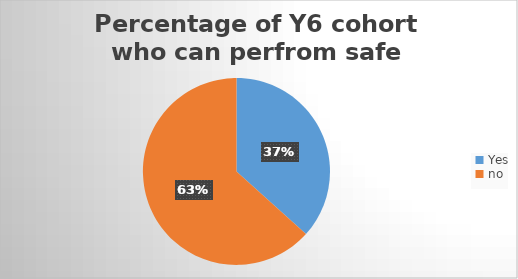
| Category | Series 0 |
|---|---|
| Yes | 11 |
| no | 19 |